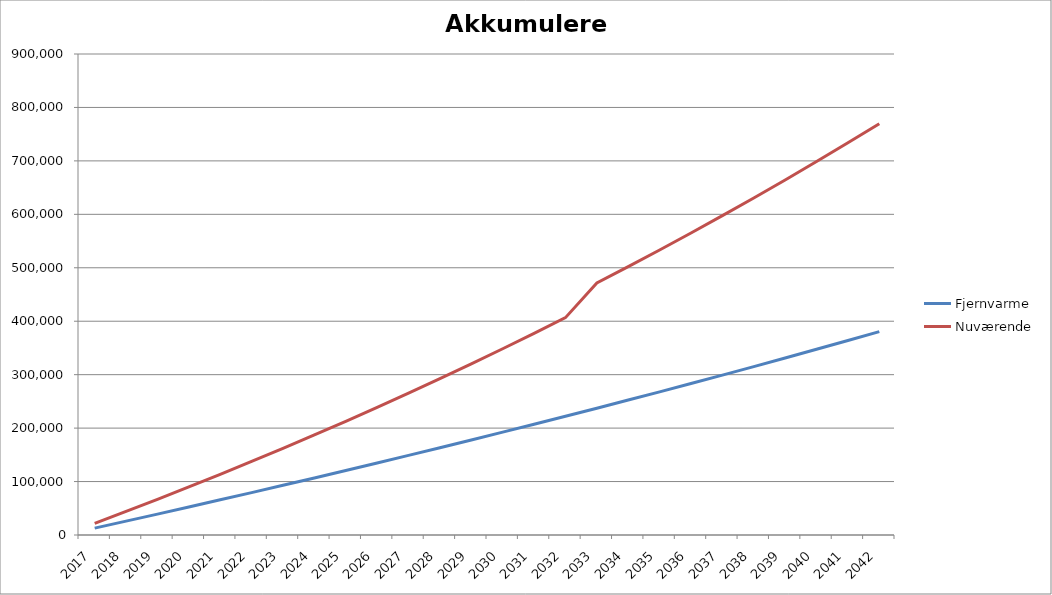
| Category | Fjernvarme | Nuværende |
|---|---|---|
| 2017.0 | 12923.454 | 21818 |
| 2018.0 | 25963.219 | 44072.36 |
| 2019.0 | 39121.621 | 66771.807 |
| 2020.0 | 52401.033 | 89925.243 |
| 2021.0 | 65803.875 | 113541.748 |
| 2022.0 | 79332.617 | 137630.583 |
| 2023.0 | 92989.775 | 162201.195 |
| 2024.0 | 106777.918 | 187263.219 |
| 2025.0 | 120699.666 | 212826.483 |
| 2026.0 | 134757.691 | 238901.013 |
| 2027.0 | 148954.719 | 265497.033 |
| 2028.0 | 163293.529 | 292624.974 |
| 2029.0 | 177776.958 | 320295.473 |
| 2030.0 | 192407.897 | 348519.383 |
| 2031.0 | 207189.297 | 377307.77 |
| 2032.0 | 222124.166 | 406671.926 |
| 2033.0 | 237215.576 | 471623.364 |
| 2034.0 | 252466.655 | 502173.831 |
| 2035.0 | 267880.598 | 533335.308 |
| 2036.0 | 283460.662 | 565120.014 |
| 2037.0 | 299210.169 | 597540.415 |
| 2038.0 | 315132.508 | 630609.223 |
| 2039.0 | 331231.137 | 664339.407 |
| 2040.0 | 347509.579 | 698744.195 |
| 2041.0 | 363971.433 | 733837.079 |
| 2042.0 | 380620.365 | 769631.821 |